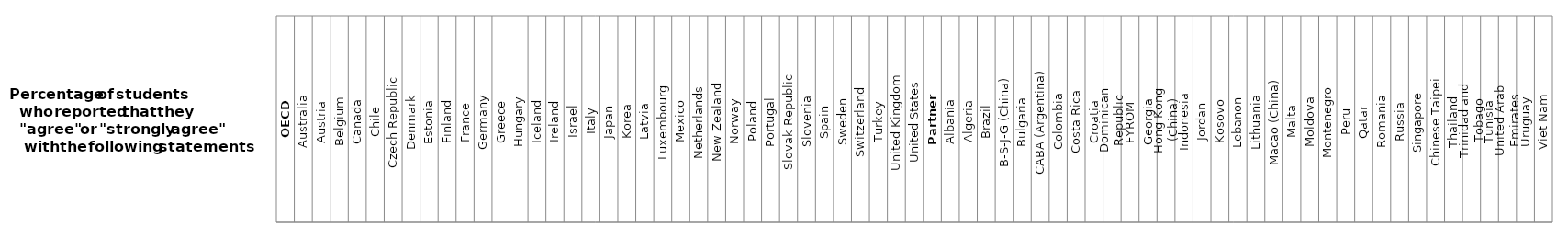
| Category | All countries and economies |
|---|---|
| OECD | 1 |
| Australia | 1 |
| Austria | 1 |
| Belgium | 1 |
| Canada | 1 |
| Chile | 1 |
| Czech Republic | 1 |
| Denmark | 1 |
| Estonia | 1 |
| Finland | 1 |
| France | 1 |
| Germany | 1 |
| Greece | 1 |
| Hungary | 1 |
| Iceland | 1 |
| Ireland | 1 |
| Israel | 1 |
| Italy | 1 |
| Japan | 1 |
| Korea | 1 |
| Latvia | 1 |
| Luxembourg | 1 |
| Mexico | 1 |
| Netherlands | 1 |
| New Zealand | 1 |
| Norway | 1 |
| Poland | 1 |
| Portugal | 1 |
| Slovak Republic | 1 |
| Slovenia | 1 |
| Spain | 1 |
| Sweden | 1 |
| Switzerland | 1 |
| Turkey | 1 |
| United Kingdom | 1 |
| United States | 1 |
| Partners | 1 |
| Albania | 1 |
| Algeria | 1 |
| Brazil | 1 |
| B-S-J-G (China) | 1 |
| Bulgaria | 1 |
| CABA (Argentina) | 1 |
| Colombia | 1 |
| Costa Rica | 1 |
| Croatia | 1 |
| Dominican Republic | 1 |
| FYROM | 1 |
| Georgia | 1 |
| Hong Kong (China) | 1 |
| Indonesia | 1 |
| Jordan | 1 |
| Kosovo | 1 |
| Lebanon | 1 |
| Lithuania | 1 |
| Macao (China) | 1 |
| Malta | 1 |
| Moldova | 1 |
| Montenegro | 1 |
| Peru | 1 |
| Qatar | 1 |
| Romania | 1 |
| Russia | 1 |
| Singapore | 1 |
| Chinese Taipei | 1 |
| Thailand | 1 |
| Trinidad and Tobago | 1 |
| Tunisia | 1 |
| United Arab Emirates | 1 |
| Uruguay | 1 |
| Viet Nam | 1 |